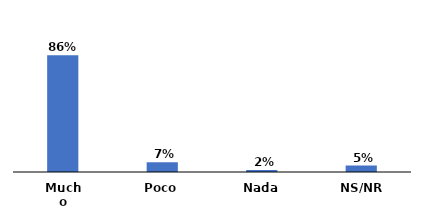
| Category | Series 0 |
|---|---|
| Mucho | 0.865 |
| Poco | 0.072 |
| Nada | 0.015 |
| NS/NR | 0.048 |